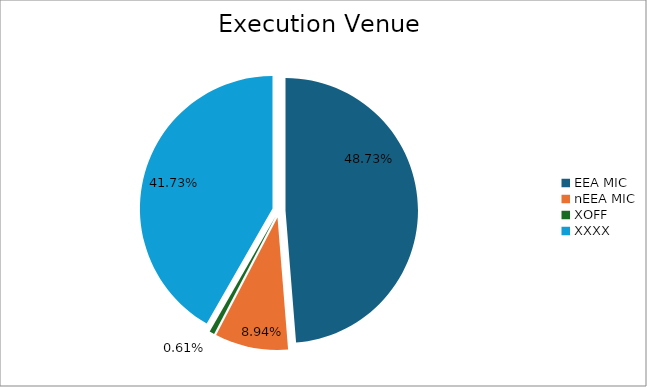
| Category | Series 0 |
|---|---|
| EEA MIC | 6498215.379 |
| nEEA MIC | 1191788.791 |
| XOFF | 80916.037 |
| XXXX | 5565110.536 |